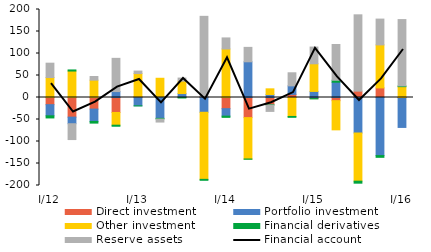
| Category | Direct investment | Portfolio investment | Other investment | Financial derivatives | Reserve assets |
|---|---|---|---|---|---|
| I/12 | -16.29 | -25.293 | 45.36 | -4.87 | 32.632 |
| II | -44.641 | -14.957 | 60.168 | 2.453 | -35.982 |
| III | -26.334 | -28.062 | 39.368 | -3.806 | 8.321 |
| IV | -33.997 | 13.465 | -28.955 | -2.395 | 75.502 |
| I/13 | 1.859 | -18.95 | 52.574 | -0.086 | 5.61 |
| II | 1.859 | -47.44 | 41.851 | -1.44 | -6.912 |
| III | 1.859 | 7.148 | 28.263 | -1.061 | 6.889 |
| IV | 1.859 | -33.596 | -152.434 | -2.15 | 182.604 |
| I/14 | -25.373 | -16.995 | 110.31 | -2.764 | 25.08 |
| II | -45.715 | 81.147 | -94.096 | -0.503 | 32.776 |
| III | -16.35 | 6.715 | 12.982 | -0.818 | -14.448 |
| IV | 7.055 | 19.403 | -43.088 | -1.962 | 29.714 |
| I/15 | -2.497 | 13.794 | 62.811 | -0.585 | 38.01 |
| II | -7.16 | 34.761 | -66.369 | 4.391 | 81.243 |
| III | 14.457 | -80.702 | -109.424 | -4.594 | 173.44 |
| IV | 21.819 | -131.988 | 97.757 | -3.981 | 58.612 |
| I/16 | -0.018 | -67.996 | 24.654 | 1.574 | 150.883 |